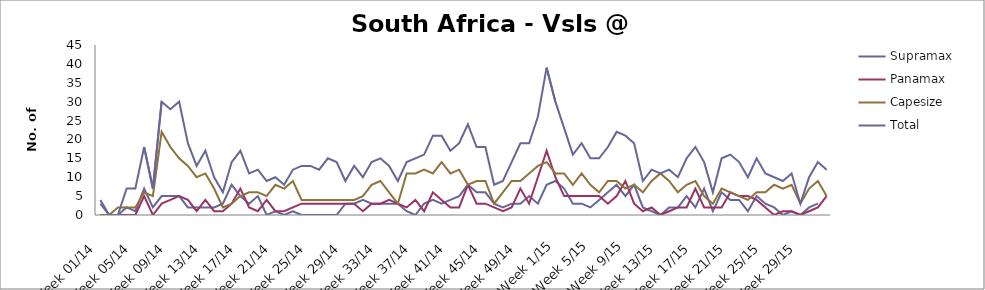
| Category | Supramax | Panamax | Capesize | Total |
|---|---|---|---|---|
| Week 01/14 | 3 | 0 | 0 | 4 |
| Week 02/14 | 0 | 0 | 0 | 0 |
| Week 03/14 | 0 | 0 | 2 | 0 |
| Week 04/14 | 2 | 0 | 2 | 7 |
| Week 05/14 | 1 | 0 | 2 | 7 |
| Week 06/14 | 7 | 5 | 6 | 18 |
| Week 07/14 | 2 | 0 | 5 | 7 |
| Week 08/14 | 5 | 3 | 22 | 30 |
| Week 09/14 | 5 | 4 | 18 | 28 |
| Week 10/14 | 5 | 5 | 15 | 30 |
| Week 11/14 | 2 | 4 | 13 | 19 |
| Week 12/14 | 2 | 1 | 10 | 13 |
| Week 13/14 | 2 | 4 | 11 | 17 |
| Week 14/14 | 2 | 1 | 7 | 10 |
| Week 15/14 | 3 | 1 | 2 | 6 |
| Week 16/14 | 8 | 3 | 3 | 14 |
| Week 17/14 | 5 | 7 | 5 | 17 |
| Week 18/14 | 3 | 2 | 6 | 11 |
| Week 19/14 | 5 | 1 | 6 | 12 |
| Week 20/14 | 0 | 4 | 5 | 9 |
| Week 21/14 | 1 | 1 | 8 | 10 |
| Week 22/14 | 0 | 1 | 7 | 8 |
| Week 23/14 | 1 | 2 | 9 | 12 |
| Week 24/14 | 0 | 3 | 4 | 13 |
| Week 25/14 | 0 | 3 | 4 | 13 |
| Week 26/14 | 0 | 3 | 4 | 12 |
| Week 27/14 | 0 | 3 | 4 | 15 |
| Week 28/14 | 0 | 3 | 4 | 14 |
| Week 29/14 | 3 | 3 | 4 | 9 |
| Week 30/14 | 3 | 3 | 4 | 13 |
| Week 31/14 | 4 | 1 | 5 | 10 |
| Week 32/14 | 3 | 3 | 8 | 14 |
| Week 33/14 | 3 | 3 | 9 | 15 |
| Week 34/14 | 3 | 4 | 6 | 13 |
| Week 35/14 | 3 | 3 | 3 | 9 |
| Week 36/14 | 1 | 2 | 11 | 14 |
| Week 37/14 | 0 | 4 | 11 | 15 |
| Week 38/14 | 3 | 1 | 12 | 16 |
| Week 39/14 | 4 | 6 | 11 | 21 |
| Week 40/14 | 3 | 4 | 14 | 21 |
| Week 41/14 | 4 | 2 | 11 | 17 |
| Week 42/14 | 5 | 2 | 12 | 19 |
| Week 43/14 | 8 | 8 | 8 | 24 |
| Week 44/14 | 6 | 3 | 9 | 18 |
| Week 45/14 | 6 | 3 | 9 | 18 |
| Week 46/14 | 3 | 2 | 3 | 8 |
| Week 47/14 | 2 | 1 | 6 | 9 |
| Week 48/14 | 3 | 2 | 9 | 14 |
| Week 49/14 | 3 | 7 | 9 | 19 |
| Week 50/14 | 5 | 3 | 11 | 19 |
| Week 51/14 | 3 | 10 | 13 | 26 |
| Week 52/14 | 8 | 17 | 14 | 39 |
| Week 1/15 | 9 | 10 | 11 | 30 |
| Week 2/15 | 7 | 5 | 11 | 23 |
| Week 3/15 | 3 | 5 | 8 | 16 |
| Week 4/15 | 3 | 5 | 11 | 19 |
| Week 5/15 | 2 | 5 | 8 | 15 |
| Week 6/15 | 4 | 5 | 6 | 15 |
| Week 7/15 | 6 | 3 | 9 | 18 |
| Week 8/15 | 8 | 5 | 9 | 22 |
| Week 9/15 | 5 | 9 | 7 | 21 |
| Week 10/15 | 8 | 3 | 8 | 19 |
| Week 11/15 | 2 | 1 | 6 | 9 |
| Week 12/15 | 1 | 2 | 9 | 12 |
| Week 13/15 | 0 | 0 | 11 | 11 |
| Week 14/15 | 2 | 1 | 9 | 12 |
| Week 15/15 | 2 | 2 | 6 | 10 |
| Week 16/15 | 5 | 2 | 8 | 15 |
| Week 17/15 | 2 | 7 | 9 | 18 |
| Week 18/15 | 7 | 2 | 5 | 14 |
| Week 19/15 | 1 | 2 | 3 | 6 |
| Week 20/15 | 6 | 2 | 7 | 15 |
| Week 21/15 | 4 | 6 | 6 | 16 |
| Week 22/15 | 4 | 5 | 5 | 14 |
| Week 23/15 | 1 | 5 | 4 | 10 |
| Week 24/15 | 5 | 4 | 6 | 15 |
| Week 25/15 | 3 | 2 | 6 | 11 |
| Week 26/15 | 2 | 0 | 8 | 10 |
| Week 27/15 | 0 | 1 | 7 | 9 |
| Week 28/15 | 1 | 1 | 8 | 11 |
| Week 29/15 | 0 | 0 | 3 | 3 |
| Week 30/15 | 2 | 1 | 7 | 10 |
| Week 31/15 | 3 | 2 | 9 | 14 |